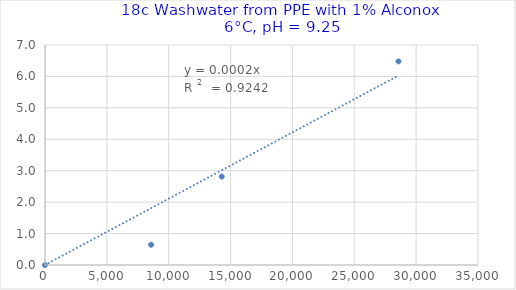
| Category | Series 0 |
|---|---|
| 0.0 | 0 |
| 8571.428571428572 | 0.645 |
| 14285.714285714286 | 2.814 |
| 28571.428571428572 | 6.477 |